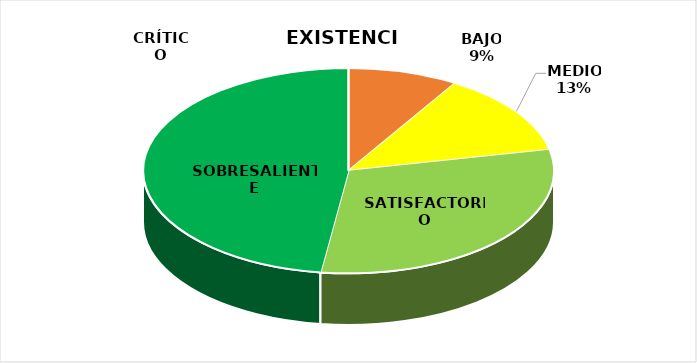
| Category | Series 1 | Series 0 |
|---|---|---|
| CRÍTICO | 0 | 2 |
| BAJO | 2 | 4 |
| MEDIO | 3 | 1 |
| SATISFACTORIO | 7 | 0 |
| SOBRESALIENTE | 11 | 50 |